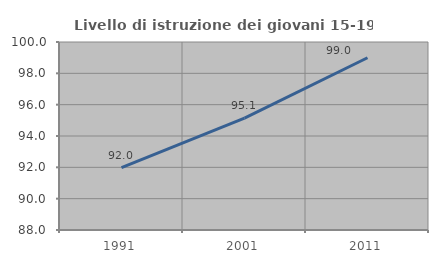
| Category | Livello di istruzione dei giovani 15-19 anni |
|---|---|
| 1991.0 | 91.983 |
| 2001.0 | 95.135 |
| 2011.0 | 98.995 |